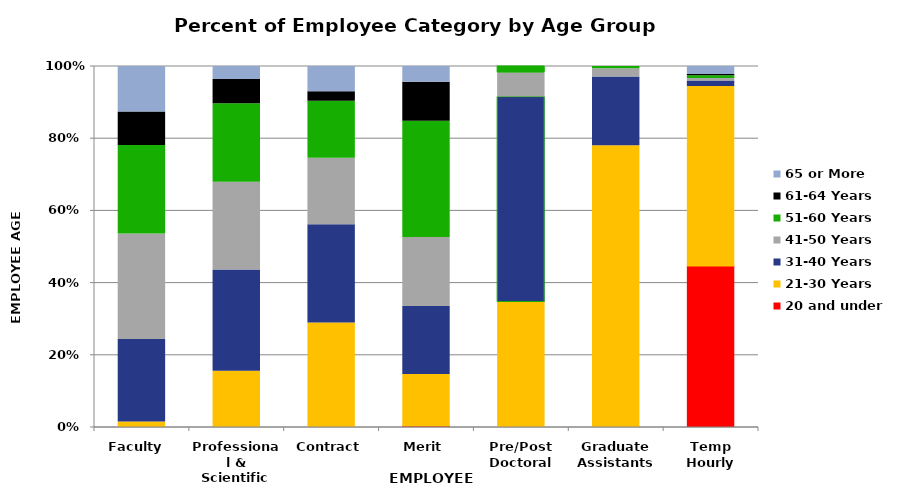
| Category | 20 and under | 21-30 Years | 31-40 Years | 41-50 Years | 51-60 Years | 61-64 Years | 65 or More |
|---|---|---|---|---|---|---|---|
| Faculty  | 0 | 0.015 | 0.228 | 0.292 | 0.245 | 0.093 | 0.126 |
| Professional & Scientific | 0 | 0.156 | 0.28 | 0.243 | 0.217 | 0.067 | 0.036 |
| Contract | 0 | 0.289 | 0.272 | 0.184 | 0.158 | 0.026 | 0.07 |
| Merit | 0.004 | 0.143 | 0.188 | 0.191 | 0.322 | 0.108 | 0.044 |
| Pre/Post Doctoral | 0 | 0.346 | 0.569 | 0.067 | 0.018 | 0 | 0 |
| Graduate Assistants | 0.001 | 0.779 | 0.191 | 0.023 | 0.006 | 0 | 0 |
| Temp Hourly | 0.447 | 0.498 | 0.015 | 0.007 | 0.007 | 0.004 | 0.022 |